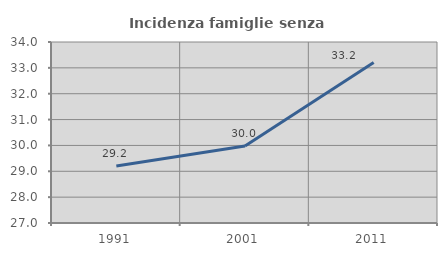
| Category | Incidenza famiglie senza nuclei |
|---|---|
| 1991.0 | 29.204 |
| 2001.0 | 29.981 |
| 2011.0 | 33.211 |